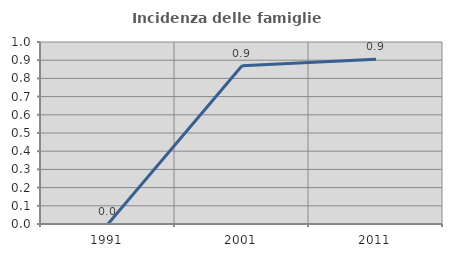
| Category | Incidenza delle famiglie numerose |
|---|---|
| 1991.0 | 0 |
| 2001.0 | 0.87 |
| 2011.0 | 0.905 |